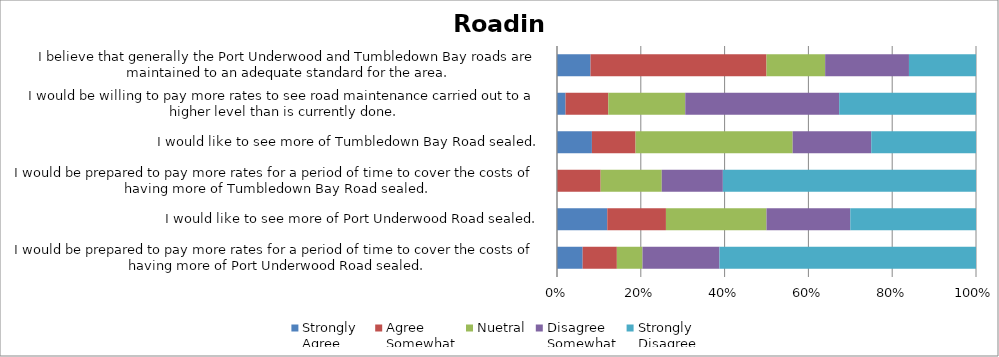
| Category | Strongly
Agree | Agree
Somewhat | Nuetral | Disagree
Somewhat | Strongly
Disagree |
|---|---|---|---|---|---|
| {I would be prepared to pay more rates for a period of time to cover the costs of having more of Port Underwood Road sealed. | 3 | 4 | 3 | 9 | 30 |
| 7I would like to see more of Port Underwood Road sealed. | 6 | 7 | 12 | 10 | 15 |
| {I would be prepared to pay more rates for a period of time to cover the costs of having more of Tumbledown Bay Road sealed. | 0 | 5 | 7 | 7 | 29 |
| 7I would like to see more of Tumbledown Bay Road sealed. | 4 | 5 | 18 | 9 | 12 |
| rI would be willing to pay more rates to see road maintenance carried out to a higher level than is currently done. | 1 | 5 | 9 | 18 | 16 |
| yI believe that generally the Port Underwood and Tumbledown Bay roads are maintained to an adequate standard for the area. | 4 | 21 | 7 | 10 | 8 |